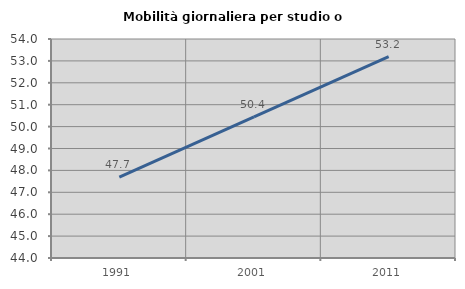
| Category | Mobilità giornaliera per studio o lavoro |
|---|---|
| 1991.0 | 47.697 |
| 2001.0 | 50.444 |
| 2011.0 | 53.193 |